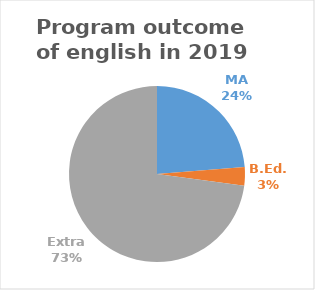
| Category | Series 0 |
|---|---|
| MA | 14 |
| B.Ed. | 2 |
| Extra | 43 |